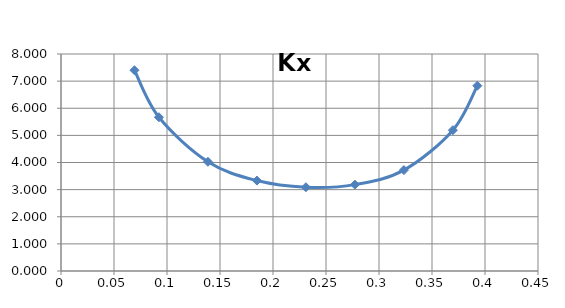
| Category | Series 0 |
|---|---|
| 0.06931499999999999 | 7.401 |
| 0.09242 | 5.668 |
| 0.13862999999999998 | 4.026 |
| 0.18484 | 3.334 |
| 0.23104999999999998 | 3.088 |
| 0.27725999999999995 | 3.184 |
| 0.3234699999999999 | 3.72 |
| 0.36968 | 5.192 |
| 0.39278499999999994 | 6.831 |